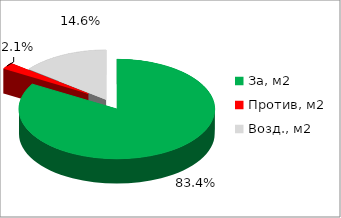
| Category | Series 0 |
|---|---|
| За, м2 | 0.834 |
| Против, м2 | 0.021 |
| Возд., м2 | 0.146 |